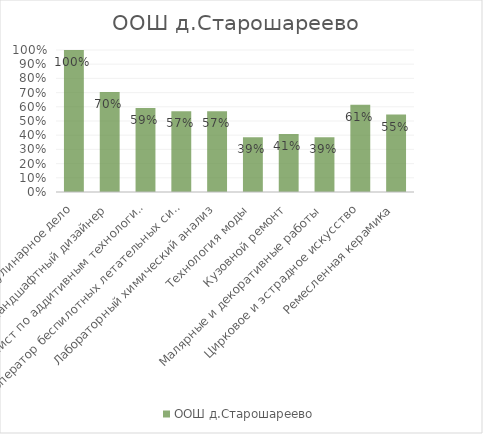
| Category | ООШ д.Старошареево |
|---|---|
| Кулинарное дело | 1 |
| Ландшафтный дизайнер | 0.705 |
| Специалист по аддитивным технологиям | 0.591 |
| Оператор беспилотных летательных систем | 0.568 |
| Лабораторный химический анализ | 0.568 |
| Технология моды | 0.386 |
| Кузовной ремонт | 0.409 |
| Малярные и декоративные работы | 0.386 |
| Цирковое и эстрадное искусство | 0.614 |
| Ремесленная керамика | 0.545 |